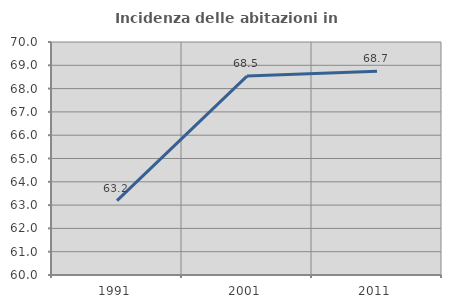
| Category | Incidenza delle abitazioni in proprietà  |
|---|---|
| 1991.0 | 63.192 |
| 2001.0 | 68.538 |
| 2011.0 | 68.746 |